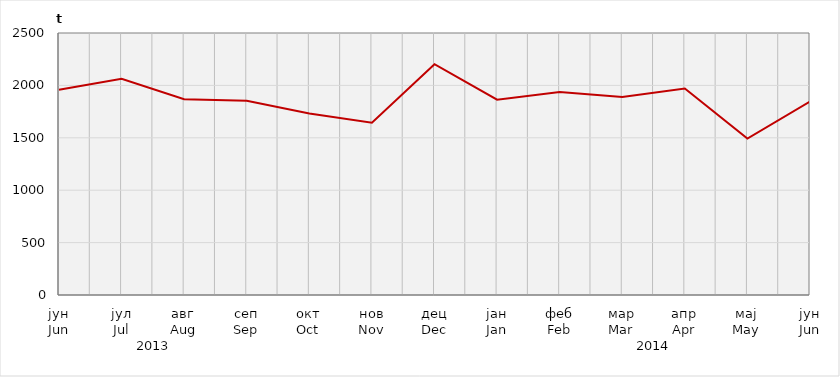
| Category | Нето тежина заклане стоке                              Net weight of  slaughtered livestock |
|---|---|
| јун
Jun | 1958717.5 |
| јул
Jul | 2062735.23 |
| авг
Aug | 1867860.8 |
| сеп
Sep | 1852800.6 |
| окт
Oct | 1731807.5 |
| нов
Nov | 1643818.93 |
| дец
Dec | 2201954.6 |
| јан
Jan | 1864263.38 |
| феб
Feb | 1937876.26 |
| мар
Mar | 1889500 |
| апр
Apr | 1970100 |
| мај
May | 1492412.5 |
| јун
Jun | 1846464.11 |